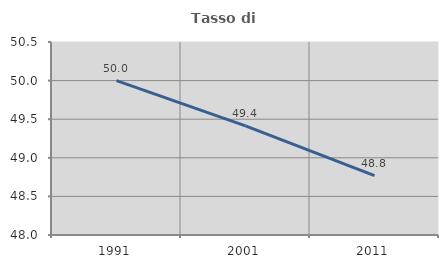
| Category | Tasso di occupazione   |
|---|---|
| 1991.0 | 50 |
| 2001.0 | 49.413 |
| 2011.0 | 48.769 |